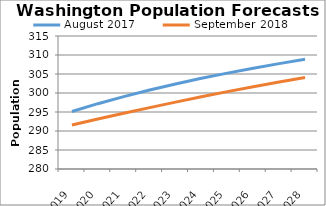
| Category | August 2017 | September 2018 |
|---|---|---|
| 2019.0 | 295.127 | 291.559 |
| 2020.0 | 297.187 | 293.159 |
| 2021.0 | 299.043 | 294.656 |
| 2022.0 | 300.772 | 296.149 |
| 2023.0 | 302.369 | 297.602 |
| 2024.0 | 303.872 | 299.025 |
| 2025.0 | 305.236 | 300.362 |
| 2026.0 | 306.524 | 301.657 |
| 2027.0 | 307.735 | 302.882 |
| 2028.0 | 308.897 | 304.062 |